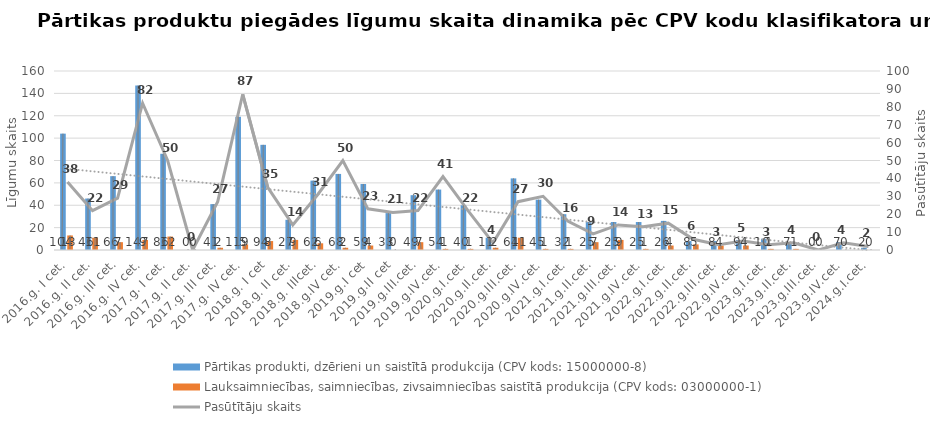
| Category | Pārtikas produkti, dzērieni un saistītā produkcija (CPV kods: 15000000-8) | Lauksaimniecības, saimniecības, zivsaimniecības saistītā produkcija (CPV kods: 03000000-1) |
|---|---|---|
| 2016.g. I cet. | 104 | 13 |
| 2016.g. II cet. | 46 | 11 |
| 2016.g. III cet. | 66 | 7 |
| 2016.g. IV cet. | 147 | 9 |
| 2017.g. I cet. | 86 | 12 |
| 2017.g. II cet. | 0 | 0 |
| 2017.g. III cet. | 41 | 2 |
| 2017.g. IV cet. | 119 | 5 |
| 2018.g. I cet | 94 | 8 |
| 2018.g. II cet. | 27 | 9 |
| 2018.g. IIIcet. | 62 | 6 |
| 2018.g.IV cet. | 68 | 2 |
| 2019.g.I cet | 59 | 4 |
| 2019.g.II cet | 33 | 0 |
| 2019.g.III.cet. | 49 | 7 |
| 2019.g.IV.cet. | 54 | 1 |
| 2020.g.I.cet. | 40 | 1 |
| 2020.g.II.cet. | 11 | 2 |
| 2020.g.III.cet. | 64 | 11 |
| 2020.g.IV.cet. | 45 | 1 |
| 2021.g.I.cet. | 32 | 1 |
| 2021.g.II.cet. | 25 | 7 |
| 2021.g.III.cet. | 25 | 9 |
| 2021.g.IV.cet. | 25 | 1 |
| 2022.g.I.cet. | 26 | 4 |
| 2022.g.II.cet. | 8 | 5 |
| 2022.g.III.cet. | 8 | 4 |
| 2022.g.IV.cet. | 9 | 4 |
| 2023.g.I.cet. | 10 | 1 |
| 2023.g.II.cet. | 7 | 1 |
| 2023.g.III.cet. | 0 | 0 |
| 2023.g.IV.cet. | 7 | 0 |
| 2024.g.I.cet. | 2 | 0 |